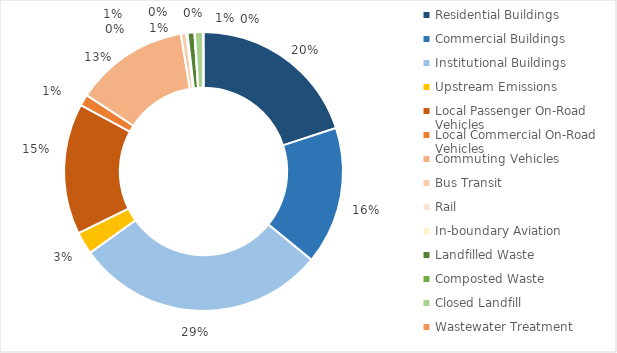
| Category | Series 0 |
|---|---|
| Residential Buildings | 420855.781 |
| Commercial Buildings | 337130.827 |
| Institutional Buildings | 615825.913 |
| Upstream Emissions | 54883.355 |
| Local Passenger On-Road Vehicles | 320559.871 |
| Local Commercial On-Road Vehicles | 27716.443 |
| Commuting Vehicles | 278322.662 |
| Bus Transit | 13274.181 |
| Rail | 135.545 |
| In-boundary Aviation | 2814.478 |
| Landfilled Waste | 16791.394 |
| Composted Waste | 890.516 |
| Closed Landfill | 19941 |
| Wastewater Treatment | 1019.453 |